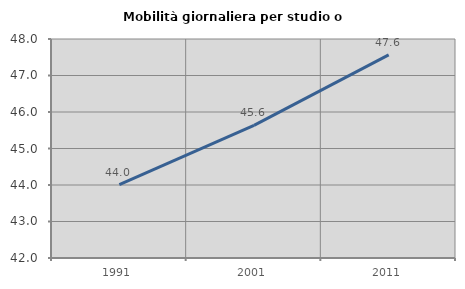
| Category | Mobilità giornaliera per studio o lavoro |
|---|---|
| 1991.0 | 44.01 |
| 2001.0 | 45.632 |
| 2011.0 | 47.564 |